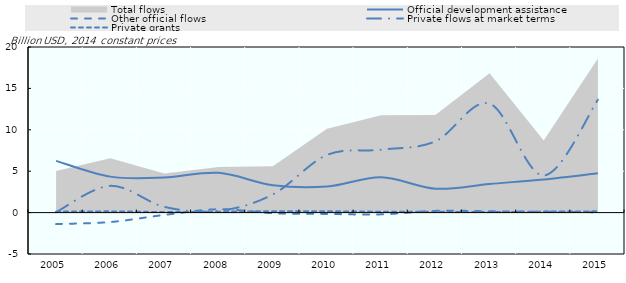
| Category | Official development assistance | Other official flows | Private flows at market terms | Private grants |
|---|---|---|---|---|
| 2005.0 | 6249.318 | -1381.248 | 54.135 | 115.021 |
| 2006.0 | 4344.898 | -1141.808 | 3227.409 | 147.038 |
| 2007.0 | 4239.693 | -278.42 | 693.268 | 67.28 |
| 2008.0 | 4804.852 | 403.337 | 204.13 | 104.151 |
| 2009.0 | 3311.902 | -72.335 | 2191.024 | 163.12 |
| 2010.0 | 3154.638 | -158.69 | 6961.377 | 158.259 |
| 2011.0 | 4274.362 | -211.091 | 7597.371 | 109.676 |
| 2012.0 | 2885.784 | 206.803 | 8604.711 | 96.28 |
| 2013.0 | 3457.401 | 162.182 | 13158.56 | 58.2 |
| 2014.0 | 4009.18 | 95.96 | 4480.04 | 120.74 |
| 2015.0 | 4766.482 | 51.236 | 13626.848 | 152.233 |